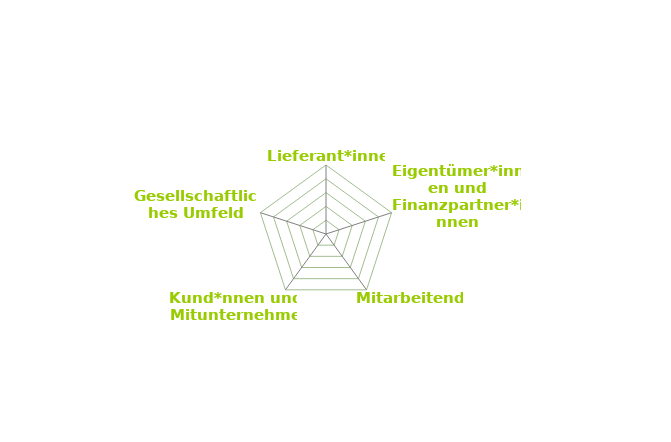
| Category | Series 0 |
|---|---|
| Lieferant*innen | 0 |
| Eigentümer*innen und Finanzpartner*innen | 0 |
| Mitarbeitende | 0 |
| Kund*nnen und Mitunternehmen | 0 |
| Gesellschaftliches Umfeld | 0 |